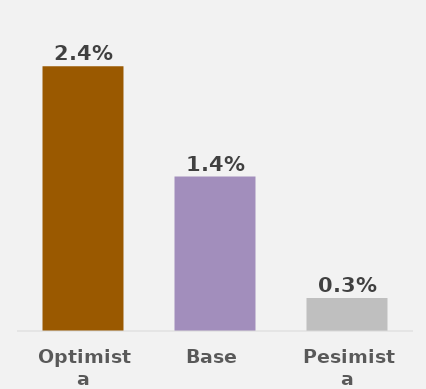
| Category | Series 0 |
|---|---|
| Optimista | 0.024 |
| Base | 0.014 |
| Pesimista | 0.003 |